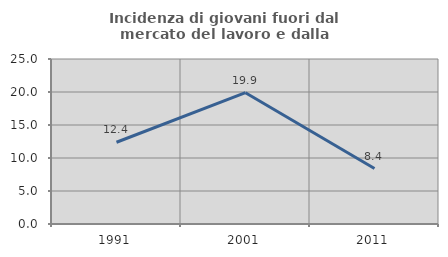
| Category | Incidenza di giovani fuori dal mercato del lavoro e dalla formazione  |
|---|---|
| 1991.0 | 12.385 |
| 2001.0 | 19.892 |
| 2011.0 | 8.397 |